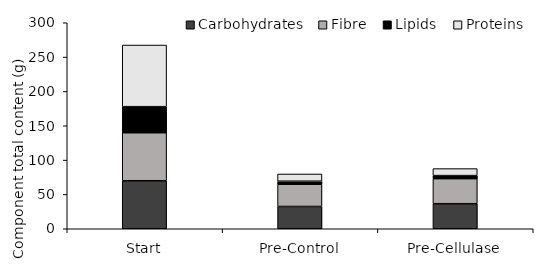
| Category | Carbohydrates  | Fibre  | Lipids  | Proteins |
|---|---|---|---|---|
| Start | 69.916 | 69.916 | 37.957 | 89.785 |
| Pre-Control | 32.437 | 32.437 | 4.358 | 10.558 |
| Pre-Cellulase | 36.489 | 36.489 | 4.425 | 10.216 |